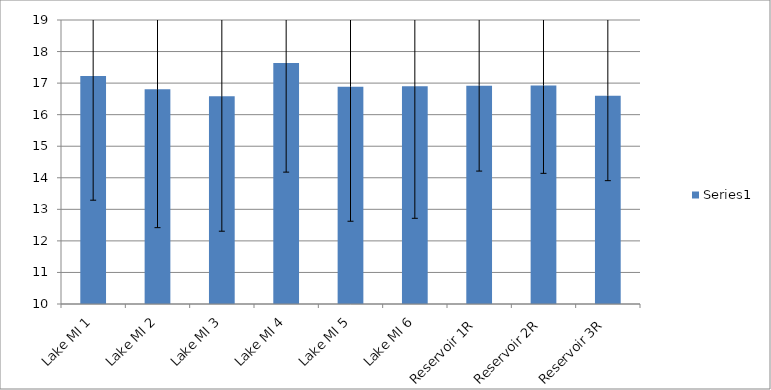
| Category | Series 0 |
|---|---|
| Lake MI 1 | 17.228 |
| Lake MI 2 | 16.809 |
| Lake MI 3 | 16.587 |
| Lake MI 4 | 17.639 |
| Lake MI 5 | 16.884 |
| Lake MI 6 | 16.902 |
| Reservoir 1R | 16.918 |
| Reservoir 2R | 16.927 |
| Reservoir 3R | 16.603 |